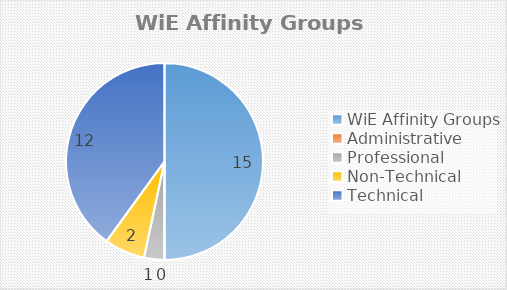
| Category | Series 0 |
|---|---|
| WiE Affinity Groups | 15 |
| Administrative | 0 |
| Professional | 1 |
| Non-Technical | 2 |
| Technical | 12 |